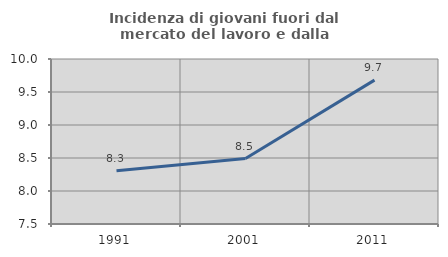
| Category | Incidenza di giovani fuori dal mercato del lavoro e dalla formazione  |
|---|---|
| 1991.0 | 8.306 |
| 2001.0 | 8.492 |
| 2011.0 | 9.679 |